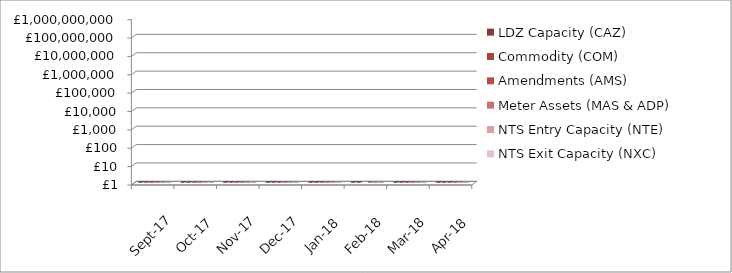
| Category | LDZ Capacity (CAZ) | Commodity (COM) | Amendments (AMS) | Meter Assets (MAS & ADP) | NTS Entry Capacity (NTE) | NTS Exit Capacity (NXC) |
|---|---|---|---|---|---|---|
| 2017-09-01 | 289415948.74 | 20098400.73 | 205300.25 | 187587.95 | 1855267.92 | 22811559.53 |
| 2017-10-01 | 299201864.14 | 26855499.51 | 321543.98 | 193840.32 | 11176717.5 | 18097117.82 |
| 2017-11-01 | 290194555.87 | 41901625.24 | 281193.04 | 187587.95 | 12089719.21 | 18734838.83 |
| 2017-12-01 | 299923728.54 | 49314715.49 | 486751.91 | 193840.34 | 12089719.21 | 18734838.83 |
| 2018-01-01 | 300085873.04 | 51013861.41 | 398601 | 193840 | 13468961.26 | 18693319.21 |
| 2018-02-01 | 271243893.07 | 49577294.91 | -97584.69 | 175082.41 | 10887736.94 | 16944144.32 |
| 2018-03-01 | 300714752.62 | 47885458.16 | 435828.94 | 193565.33 | 12522228.64 | 16944144.32 |
| 2018-04-01 | 302200317.27 | 29034584.31 | 1543453.44 | 194233.3 | 1577511.57 | 18111359.22 |